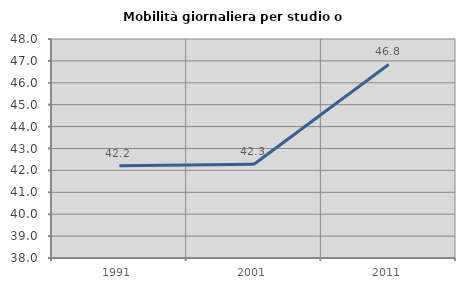
| Category | Mobilità giornaliera per studio o lavoro |
|---|---|
| 1991.0 | 42.208 |
| 2001.0 | 42.28 |
| 2011.0 | 46.839 |